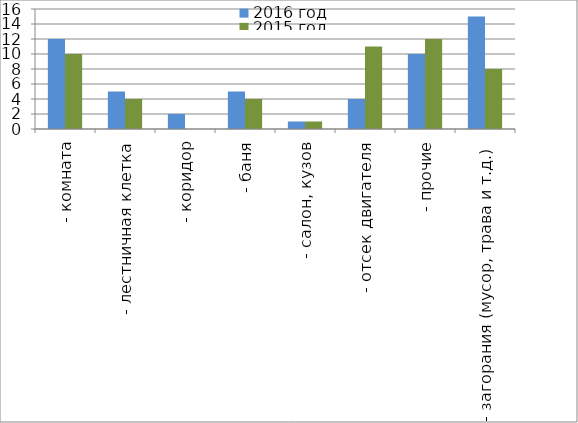
| Category | 2016 год | 2015 год |
|---|---|---|
|  - комната | 12 | 10 |
|  - лестничная клетка | 5 | 4 |
|  - коридор | 2 | 0 |
|  - баня | 5 | 4 |
|  - салон, кузов | 1 | 1 |
|  - отсек двигателя | 4 | 11 |
| - прочие | 10 | 12 |
| - загорания (мусор, трава и т.д.)  | 15 | 8 |